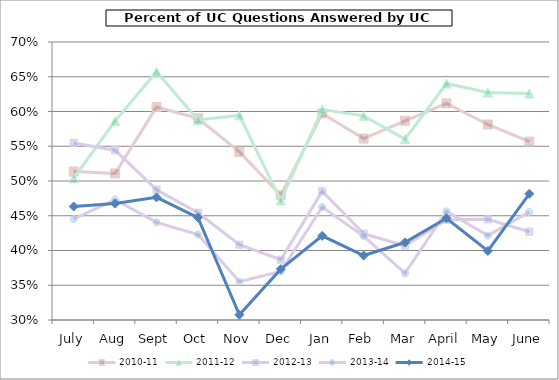
| Category | 2010-11 | 2011-12 | 2012-13 | 2013-14 | 2014-15 |
|---|---|---|---|---|---|
| July | 0.514 | 0.504 | 0.555 | 0.445 | 0.463 |
| Aug | 0.511 | 0.586 | 0.544 | 0.473 | 0.468 |
| Sept | 0.606 | 0.657 | 0.487 | 0.44 | 0.476 |
| Oct | 0.59 | 0.588 | 0.454 | 0.423 | 0.447 |
| Nov | 0.542 | 0.594 | 0.408 | 0.355 | 0.308 |
| Dec | 0.48 | 0.472 | 0.387 | 0.37 | 0.373 |
| Jan | 0.597 | 0.603 | 0.485 | 0.463 | 0.421 |
| Feb | 0.561 | 0.594 | 0.424 | 0.421 | 0.393 |
| Mar | 0.587 | 0.56 | 0.407 | 0.367 | 0.412 |
| April | 0.612 | 0.64 | 0.444 | 0.456 | 0.446 |
| May | 0.581 | 0.627 | 0.445 | 0.421 | 0.399 |
| June | 0.557 | 0.626 | 0.427 | 0.455 | 0.482 |